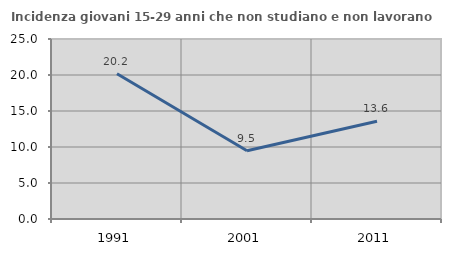
| Category | Incidenza giovani 15-29 anni che non studiano e non lavorano  |
|---|---|
| 1991.0 | 20.175 |
| 2001.0 | 9.474 |
| 2011.0 | 13.566 |